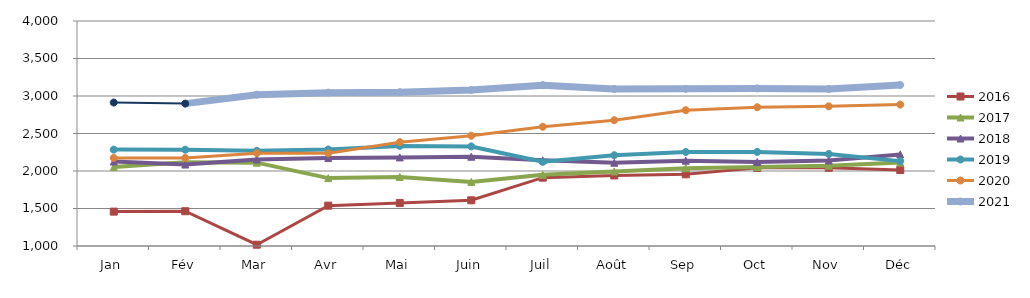
| Category | 2015 | 2016 | 2017 | 2018 | 2019 | 2020 | 2021 |
|---|---|---|---|---|---|---|---|
| Jan |  | 1458.367 | 2054.548 | 2126.43 | 2285.077 | 2174.068 | 2912.819 |
| Fév |  | 1463.569 | 2115.464 | 2086.116 | 2284.041 | 2173.963 | 2898.489 |
| Mar |  | 1017.2 | 2111.342 | 2154.19 | 2268.401 | 2238.064 | 3017.436 |
| Avr |  | 1538.072 | 1905.351 | 2172.692 | 2286.951 | 2235.688 | 3044.815 |
| Mai |  | 1572.182 | 1920.479 | 2181.426 | 2334.869 | 2384.721 | 3050.874 |
| Juin |  | 1609.355 | 1854.713 | 2190.216 | 2327.493 | 2470.094 | 3080.307 |
| Juil |  | 1910.74 | 1949.204 | 2142.84 | 2123.041 | 2589.895 | 3144.694 |
| Août |  | 1940.578 | 1993.991 | 2110.076 | 2210.394 | 2677.173 | 3094.04 |
| Sep |  | 1955.778 | 2037.81 | 2137.072 | 2253.916 | 2811.251 | 3095.309 |
| Oct |  | 2041.667 | 2053.581 | 2119.873 | 2254.192 | 2850.494 | 3100.983 |
| Nov |  | 2042.699 | 2069.345 | 2140.872 | 2226.879 | 2862.02 | 3093.674 |
| Déc |  | 2013.752 | 2111.996 | 2221.568 | 2131.58 | 2885.572 | 3146.391 |